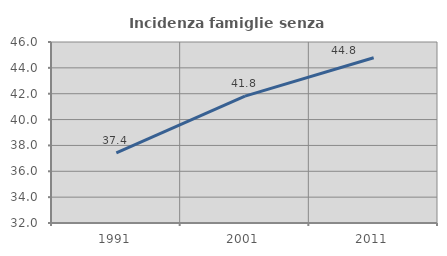
| Category | Incidenza famiglie senza nuclei |
|---|---|
| 1991.0 | 37.419 |
| 2001.0 | 41.818 |
| 2011.0 | 44.785 |